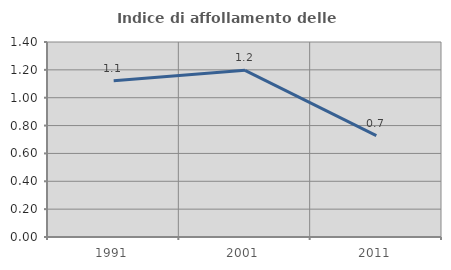
| Category | Indice di affollamento delle abitazioni  |
|---|---|
| 1991.0 | 1.121 |
| 2001.0 | 1.197 |
| 2011.0 | 0.728 |